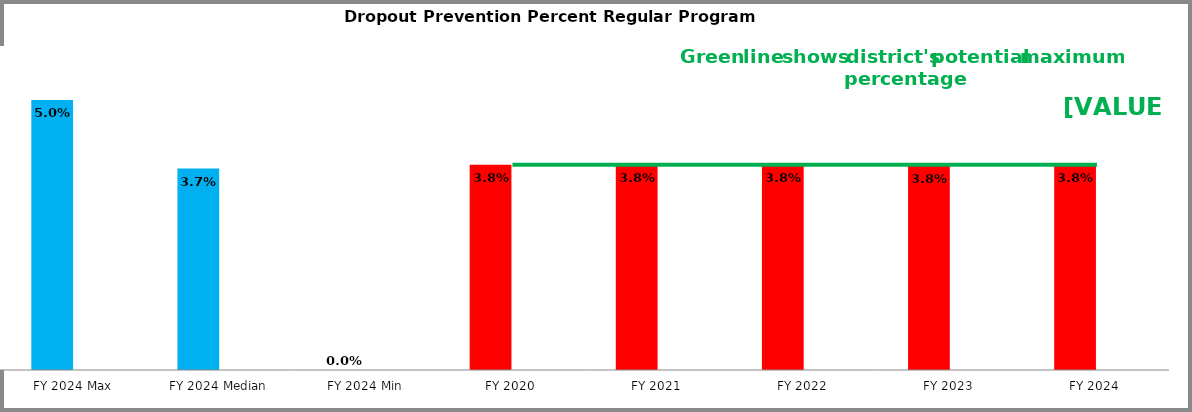
| Category | Series 0 | Series 1 |
|---|---|---|
| FY 2024 Max | 0.05 |  |
| FY 2024 Median | 0.037 |  |
| FY 2024 Min | 0 |  |
| FY 2020 | 0.038 |  |
| FY 2021 | 0.038 |  |
| FY 2022 | 0.038 |  |
| FY 2023 | 0.038 |  |
| FY 2024 | 0.038 |  |